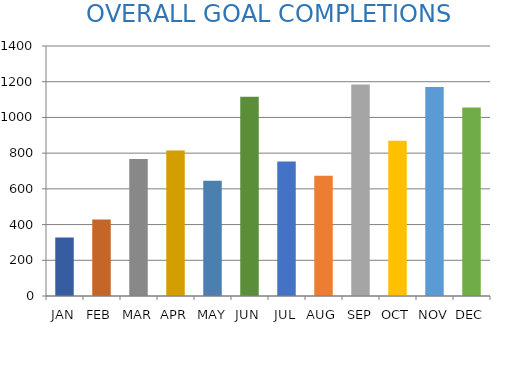
| Category | Series 0 |
|---|---|
| JAN | 327 |
| FEB | 429 |
| MAR | 767 |
| APR | 815 |
| MAY | 645 |
| JUN | 1116 |
| JUL | 753 |
| AUG | 673 |
| SEP | 1184 |
| OCT | 870 |
| NOV | 1170 |
| DEC | 1055 |